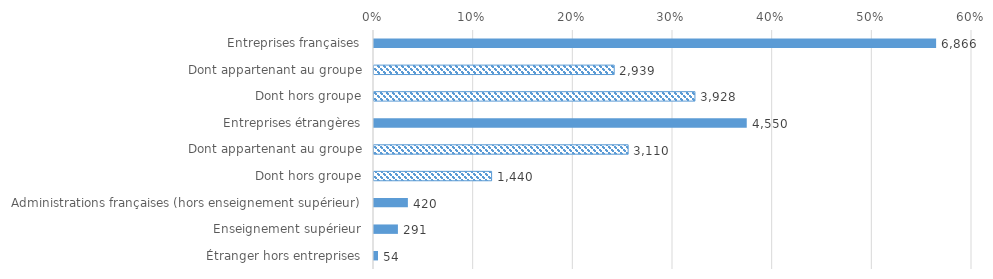
| Category | Series 0 |
|---|---|
| Entreprises françaises | 0.564 |
| Dont appartenant au groupe | 0.241 |
| Dont hors groupe | 0.322 |
| Entreprises étrangères | 0.374 |
| Dont appartenant au groupe | 0.255 |
| Dont hors groupe | 0.118 |
| Administrations françaises (hors enseignement supérieur) | 0.034 |
| Enseignement supérieur | 0.024 |
| Étranger hors entreprises | 0.004 |